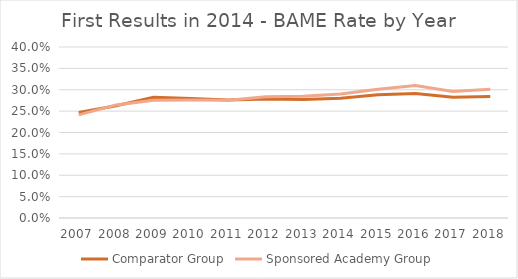
| Category | Comparator Group | Sponsored Academy Group |
|---|---|---|
| 2007.0 | 0.247 | 0.241 |
| 2008.0 | 0.263 | 0.265 |
| 2009.0 | 0.282 | 0.276 |
| 2010.0 | 0.28 | 0.276 |
| 2011.0 | 0.276 | 0.276 |
| 2012.0 | 0.278 | 0.284 |
| 2013.0 | 0.277 | 0.285 |
| 2014.0 | 0.28 | 0.29 |
| 2015.0 | 0.288 | 0.301 |
| 2016.0 | 0.291 | 0.31 |
| 2017.0 | 0.282 | 0.296 |
| 2018.0 | 0.284 | 0.301 |